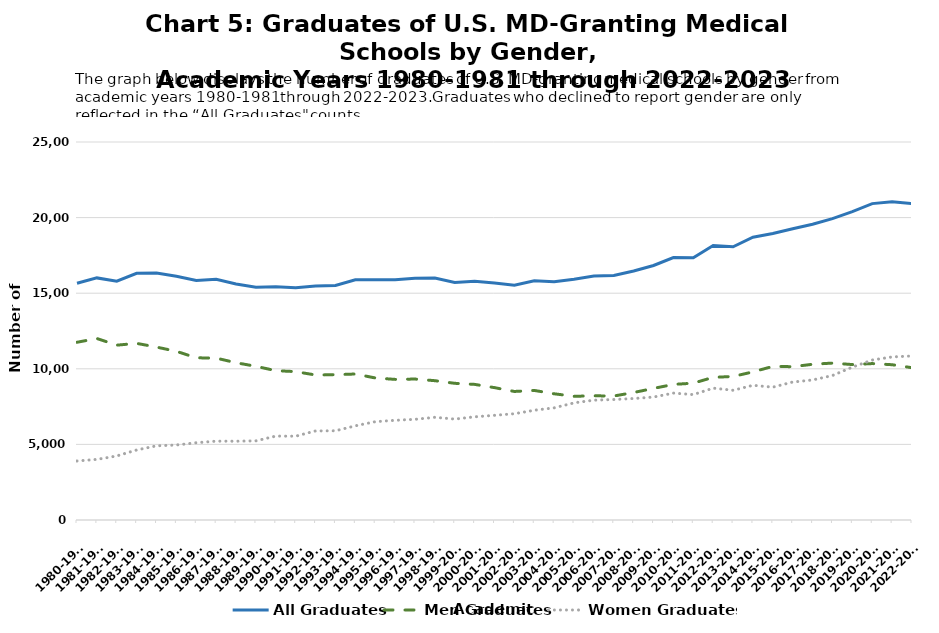
| Category | All Graduates | Men Graduates | Women Graduates |
|---|---|---|---|
| 1980-1981 | 15657 | 11755 | 3902 |
| 1981-1982 | 16012 | 12004 | 4008 |
| 1982-1983 | 15799 | 11563 | 4236 |
| 1983-1984 | 16313 | 11682 | 4631 |
| 1984-1985 | 16342 | 11436 | 4906 |
| 1985-1986 | 16116 | 11155 | 4961 |
| 1986-1987 | 15837 | 10728 | 5109 |
| 1987-1988 | 15921 | 10707 | 5214 |
| 1988-1989 | 15613 | 10401 | 5211 |
| 1989-1990 | 15400 | 10165 | 5235 |
| 1990-1991 | 15425 | 9876 | 5549 |
| 1991-1992 | 15357 | 9813 | 5544 |
| 1992-1993 | 15479 | 9588 | 5891 |
| 1993-1994 | 15511 | 9611 | 5900 |
| 1994-1995 | 15884 | 9656 | 6228 |
| 1995-1996 | 15895 | 9394 | 6501 |
| 1996-1997 | 15894 | 9300 | 6594 |
| 1997-1998 | 15981 | 9322 | 6659 |
| 1998-1999 | 16005 | 9214 | 6791 |
| 1999-2000 | 15715 | 9040 | 6675 |
| 2000-2001 | 15793 | 8969 | 6824 |
| 2001-2002 | 15678 | 8755 | 6923 |
| 2002-2003 | 15528 | 8501 | 7027 |
| 2003-2004 | 15828 | 8569 | 7259 |
| 2004-2005 | 15764 | 8348 | 7416 |
| 2005-2006 | 15927 | 8180 | 7747 |
| 2006-2007 | 16140 | 8215 | 7925 |
| 2007-2008 | 16168 | 8199 | 7969 |
| 2008-2009 | 16466 | 8431 | 8035 |
| 2009-2010 | 16835 | 8705 | 8130 |
| 2010-2011 | 17361 | 8967 | 8394 |
| 2011-2012 | 17343 | 9050 | 8293 |
| 2012-2013 | 18155 | 9435 | 8720 |
| 2013-2014 | 18072 | 9493 | 8579 |
| 2014-2015 | 18703 | 9795 | 8908 |
| 2015-2016 | 18943 | 10159 | 8784 |
| 2016-2017 | 19262 | 10139 | 9123 |
| 2017-2018 | 19562 | 10300 | 9262 |
| 2018-2019 | 19935 | 10378 | 9557 |
| 2019-2020 | 20390 | 10280 | 10110 |
| 2020-2021 | 20926 | 10346 | 10580 |
| 2021-2022 | 21056 | 10270 | 10785 |
| 2022-2023 | 20920 | 10071 | 10849 |